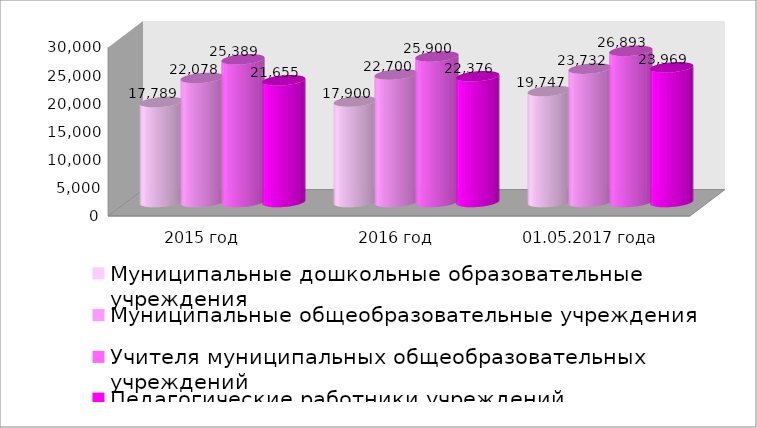
| Category | Муниципальные дошкольные образовательные учреждения | Муниципальные общеобразовательные учреждения | Учителя муниципальных общеобразовательных учреждений | Педагогические работники учреждений дополнительного образования |
|---|---|---|---|---|
| 2015 год | 17789 | 22078 | 25389 | 21655 |
| 2016 год | 17900 | 22700 | 25900 | 22376 |
| 01.05.2017 года | 19747 | 23732 | 26893 | 23969 |